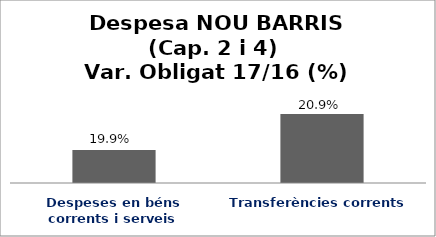
| Category | Series 0 |
|---|---|
| Despeses en béns corrents i serveis | 0.199 |
| Transferències corrents | 0.209 |